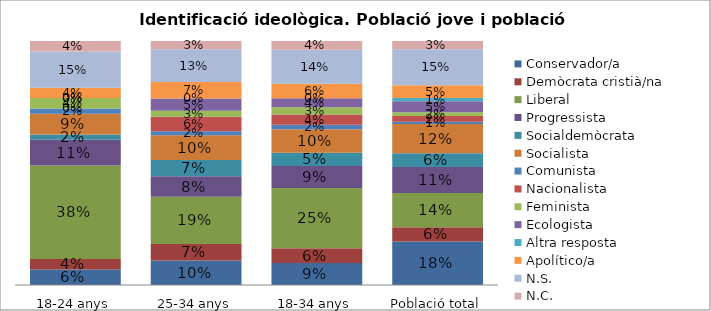
| Category | Conservador/a | Demòcrata cristià/na | Liberal | Progressista | Socialdemòcrata | Socialista | Comunista | Nacionalista | Feminista | Ecologista | Altra resposta | Apolítico/a | N.S. | N.C. |
|---|---|---|---|---|---|---|---|---|---|---|---|---|---|---|
| 18-24 anys | 0.064 | 0.043 | 0.383 | 0.106 | 0.021 | 0.085 | 0.021 | 0 | 0.043 | 0 | 0 | 0.043 | 0.149 | 0.043 |
| 25-34 anys | 0.101 | 0.067 | 0.193 | 0.084 | 0.067 | 0.101 | 0.017 | 0.059 | 0.025 | 0.05 | 0 | 0.067 | 0.134 | 0.034 |
| 18-34 anys | 0.09 | 0.06 | 0.247 | 0.09 | 0.054 | 0.096 | 0.018 | 0.042 | 0.03 | 0.036 | 0 | 0.06 | 0.139 | 0.036 |
| Població total | 0.178 | 0.059 | 0.141 | 0.106 | 0.057 | 0.119 | 0.01 | 0.023 | 0.015 | 0.045 | 0.013 | 0.052 | 0.148 | 0.034 |